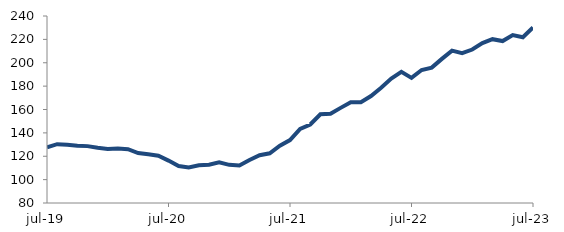
| Category | Series 0 |
|---|---|
| 2019-07-01 | 127.653 |
| 2019-08-01 | 130.323 |
| 2019-09-01 | 129.814 |
| 2019-10-01 | 129.013 |
| 2019-11-01 | 128.663 |
| 2019-12-01 | 127.192 |
| 2020-01-01 | 126.144 |
| 2020-02-01 | 126.638 |
| 2020-03-01 | 125.992 |
| 2020-04-01 | 122.726 |
| 2020-05-01 | 121.669 |
| 2020-06-01 | 120.485 |
| 2020-07-01 | 116.268 |
| 2020-08-01 | 111.597 |
| 2020-09-01 | 110.39 |
| 2020-10-01 | 112.229 |
| 2020-11-01 | 112.769 |
| 2020-12-01 | 114.741 |
| 2021-01-01 | 112.625 |
| 2021-02-01 | 112.14 |
| 2021-03-01 | 116.74 |
| 2021-04-01 | 120.911 |
| 2021-05-01 | 122.536 |
| 2021-06-01 | 128.968 |
| 2021-07-01 | 133.864 |
| 2021-08-01 | 143.384 |
| 2021-09-01 | 147.196 |
| 2021-10-01 | 155.883 |
| 2021-11-01 | 156.426 |
| 2021-12-01 | 161.4 |
| 2022-01-01 | 166.276 |
| 2022-02-01 | 166.219 |
| 2022-03-01 | 171.531 |
| 2022-04-01 | 178.644 |
| 2022-05-01 | 186.465 |
| 2022-06-01 | 192.187 |
| 2022-07-01 | 187.044 |
| 2022-08-01 | 193.806 |
| 2022-09-01 | 195.846 |
| 2022-10-01 | 203.287 |
| 2022-11-01 | 210.344 |
| 2022-12-01 | 208.16 |
| 2023-01-01 | 211.29 |
| 2023-02-01 | 216.772 |
| 2023-03-01 | 220.156 |
| 2023-04-01 | 218.537 |
| 2023-05-01 | 223.702 |
| 2023-06-01 | 221.798 |
| 2023-07-01 | 230.236 |